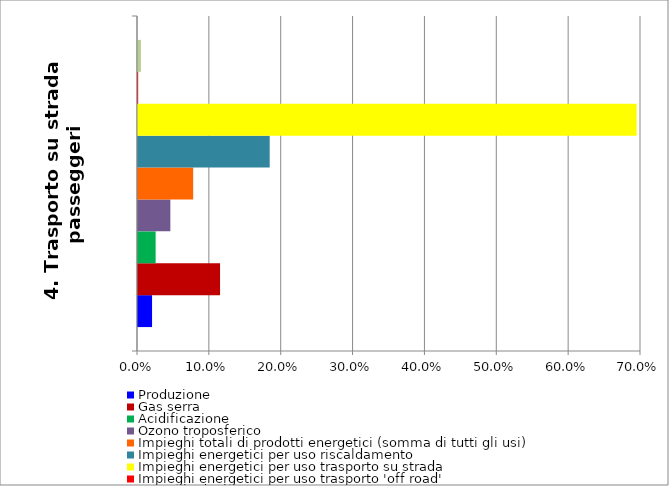
| Category | Produzione | Gas serra | Acidificazione | Ozono troposferico | Impieghi totali di prodotti energetici (somma di tutti gli usi) | Impieghi energetici per uso riscaldamento | Impieghi energetici per uso trasporto su strada | Impieghi energetici per uso trasporto 'off road' | Impieghi di elettricità |
|---|---|---|---|---|---|---|---|---|---|
| 4. Trasporto su strada passeggeri  | 0.02 | 0.114 | 0.025 | 0.045 | 0.077 | 0.183 | 0.694 | 0 | 0.004 |